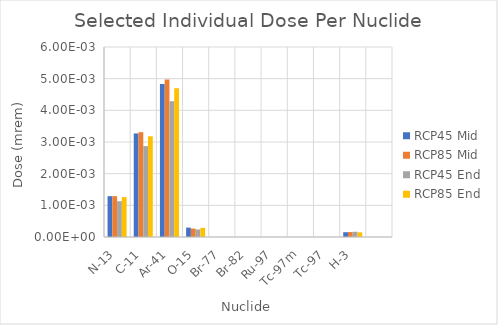
| Category | RCP45 Mid | RCP85 Mid | RCP45 End | RCP85 End |
|---|---|---|---|---|
| N-13 | 0.001 | 0.001 | 0.001 | 0.001 |
| C-11 | 0.003 | 0.003 | 0.003 | 0.003 |
| Ar-41 | 0.005 | 0.005 | 0.004 | 0.005 |
| O-15 | 0 | 0 | 0 | 0 |
| Br-77 | 0 | 0 | 0 | 0 |
| Br-82 | 0 | 0 | 0 | 0 |
| Ru-97 | 0 | 0 | 0 | 0 |
| Tc-97m | 0 | 0 | 0 | 0 |
| Tc-97 | 0 | 0 | 0 | 0 |
| H-3 | 0 | 0 | 0 | 0 |